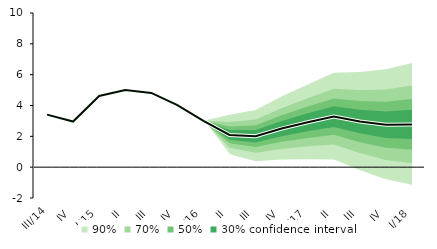
| Category | linka | Střed předpovědi |
|---|---|---|
| III/14 | 3.41 | 3.41 |
| IV | 2.96 | 2.96 |
| I/15 | 4.618 | 4.618 |
| II | 5.004 | 5.004 |
| III | 4.815 | 4.815 |
| IV | 4.027 | 4.027 |
| I/16 | 3.004 | 3.004 |
| II | 2.092 | 2.092 |
| III | 2.01 | 2.01 |
| IV | 2.503 | 2.503 |
| I/17 | 2.911 | 2.911 |
| II | 3.278 | 3.278 |
| III | 2.959 | 2.959 |
| IV | 2.75 | 2.75 |
| I/18 | 2.776 | 2.776 |